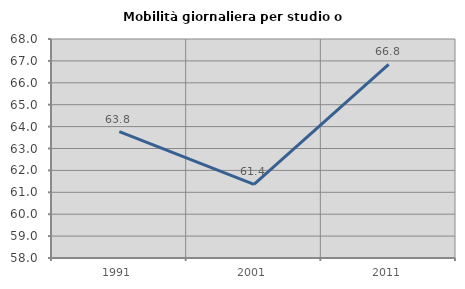
| Category | Mobilità giornaliera per studio o lavoro |
|---|---|
| 1991.0 | 63.773 |
| 2001.0 | 61.358 |
| 2011.0 | 66.836 |